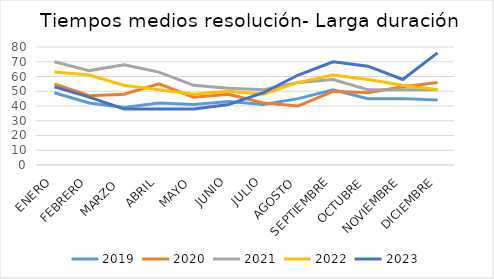
| Category | 2019 | 2020 | 2021 | 2022 | 2023 |
|---|---|---|---|---|---|
| ENERO | 49 | 55 | 70 | 63 | 53 |
| FEBRERO | 42 | 47 | 64 | 61 | 46 |
| MARZO  | 39 | 48 | 68 | 54 | 38 |
| ABRIL | 42 | 55 | 63 | 51 | 38 |
| MAYO | 41 | 46 | 54 | 48 | 38 |
| JUNIO | 43 | 48 | 52 | 50 | 41 |
| JULIO | 41 | 42 | 51 | 48 | 49 |
| AGOSTO | 45 | 40 | 56 | 56 | 61 |
| SEPTIEMBRE | 51 | 50 | 58 | 61 | 70 |
| OCTUBRE | 45 | 49 | 51 | 58 | 67 |
| NOVIEMBRE | 45 | 53 | 51 | 54 | 58 |
| DICIEMBRE | 44 | 56 | 51 | 51 | 76 |